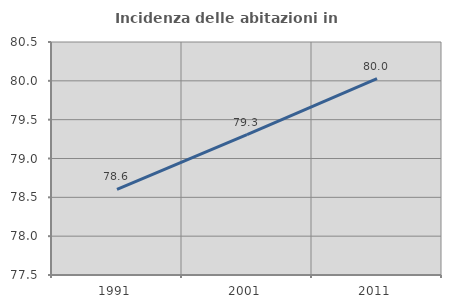
| Category | Incidenza delle abitazioni in proprietà  |
|---|---|
| 1991.0 | 78.601 |
| 2001.0 | 79.306 |
| 2011.0 | 80.029 |